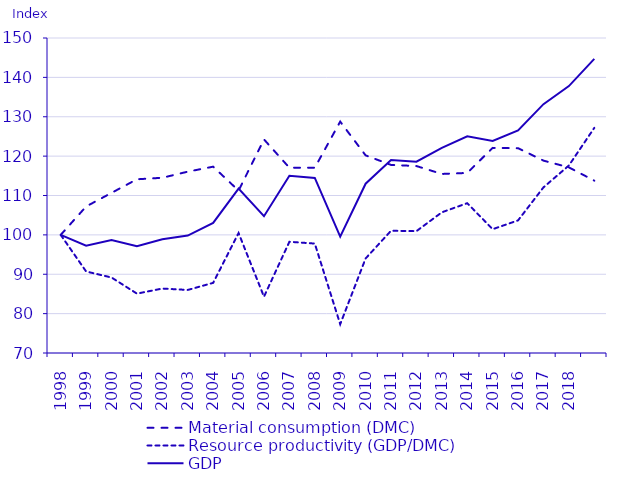
| Category | Material consumption (DMC) | Resource productivity (GDP/DMC) | GDP |
|---|---|---|---|
| 1998.0 | 100 | 100 | 100 |
| 1999.0 | 107.205 | 90.706 | 97.241 |
| 2000.0 | 110.669 | 89.173 | 98.687 |
| 2001.0 | 114.118 | 85.08 | 97.091 |
| 2002.0 | 114.502 | 86.367 | 98.892 |
| 2003.0 | 116.054 | 86.014 | 99.823 |
| 2004.0 | 117.324 | 87.813 | 103.025 |
| 2005.0 | 111.24 | 100.472 | 111.765 |
| 2006.0 | 124.243 | 84.298 | 104.734 |
| 2007.0 | 117.051 | 98.243 | 114.994 |
| 2008.0 | 117.055 | 97.792 | 114.471 |
| 2009.0 | 128.766 | 77.306 | 99.544 |
| 2010.0 | 120.194 | 94.007 | 112.991 |
| 2011.0 | 117.77 | 101.046 | 119.002 |
| 2012.0 | 117.482 | 100.944 | 118.591 |
| 2013.0 | 115.472 | 105.73 | 122.089 |
| 2014.0 | 115.735 | 108.048 | 125.049 |
| 2015.0 | 122.095 | 101.443 | 123.857 |
| 2016.0 | 122.013 | 103.682 | 126.506 |
| 2017.0 | 118.856 | 112.068 | 133.201 |
| 2018.0 | 117.143 | 117.62 | 137.784 |